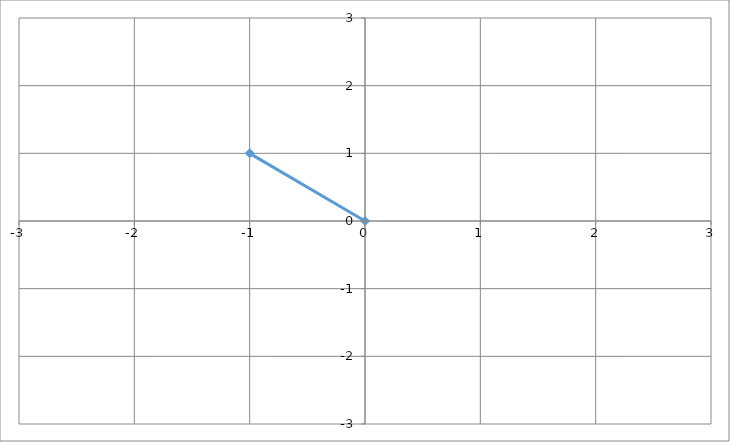
| Category | Series 0 |
|---|---|
| 0.0 | 0 |
| -1.0 | 1 |